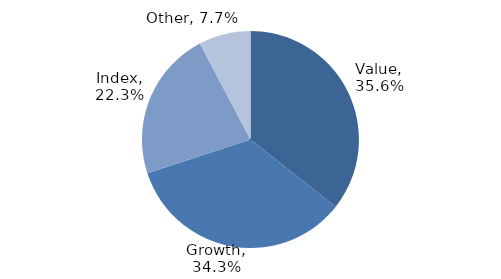
| Category | Investment Style |
|---|---|
| Value | 0.356 |
| Growth | 0.343 |
| Index | 0.223 |
| Other | 0.077 |